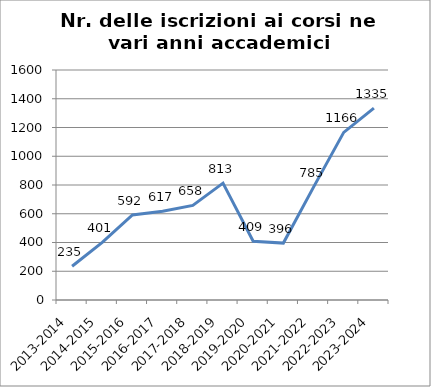
| Category | Nr. Iscrizioni ai Corsi |
|---|---|
| 2013-2014 | 235 |
| 2014-2015 | 401 |
| 2015-2016 | 592 |
| 2016-2017 | 617 |
| 2017-2018 | 658 |
| 2018-2019 | 813 |
| 2019-2020 | 409 |
| 2020-2021 | 396 |
| 2021-2022 | 785 |
| 2022-2023 | 1166 |
| 2023-2024 | 1335 |